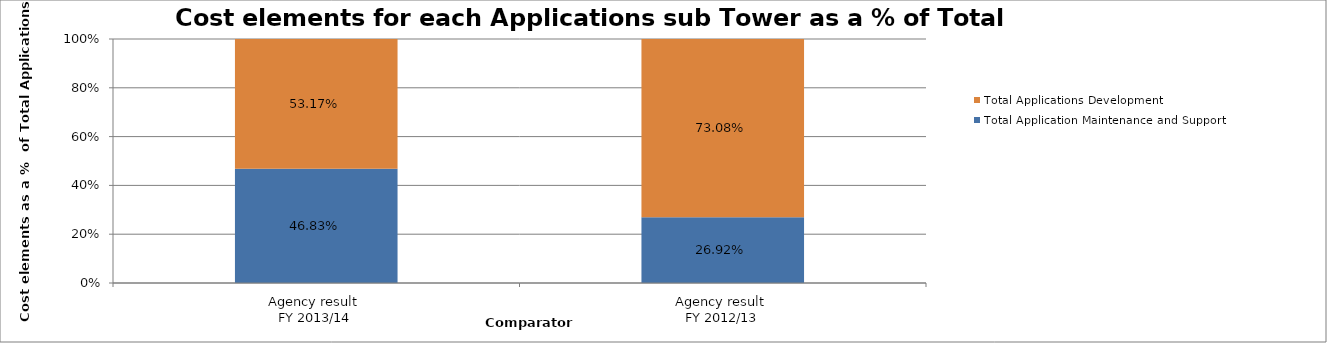
| Category | Total Application Maintenance and Support | Total Applications Development |
|---|---|---|
| Agency result 
FY 2013/14 | 0.468 | 0.532 |
| Agency result 
FY 2012/13 | 0.269 | 0.731 |